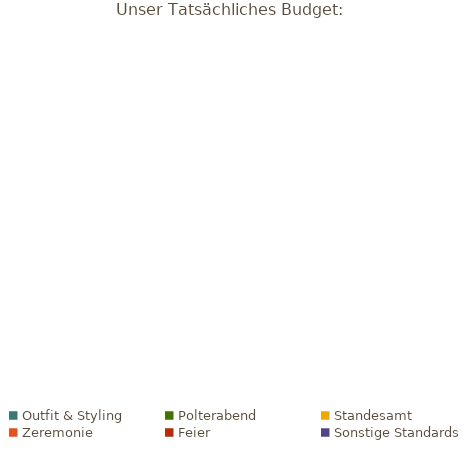
| Category | Tatsächliches Budget |
|---|---|
| Outfit & Styling | 0 |
| Polterabend | 0 |
| Standesamt | 0 |
| Zeremonie | 0 |
| Feier | 0 |
| Sonstige Standards | 0 |